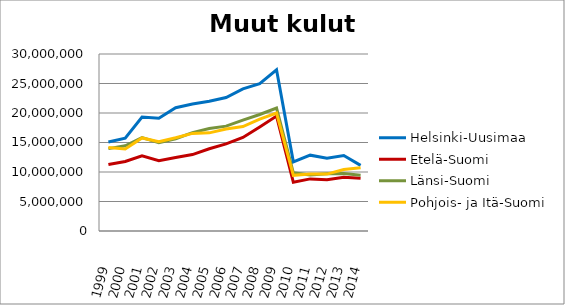
| Category | Helsinki-Uusimaa | Etelä-Suomi | Länsi-Suomi | Pohjois- ja Itä-Suomi |
|---|---|---|---|---|
| 1999.0 | 15075087.82 | 11254549.77 | 13963936.11 | 14151753.8 |
| 2000.0 | 15726916.6 | 11787547.33 | 14441678.84 | 13907825.34 |
| 2001.0 | 19327133.74 | 12736302.24 | 15831894.83 | 15766495.64 |
| 2002.0 | 19112350 | 11929732 | 14955923 | 15120131 |
| 2003.0 | 20891954 | 12464103 | 15641850 | 15793660 |
| 2004.0 | 21535320 | 12956816 | 16668644 | 16540060 |
| 2005.0 | 21977846 | 13947073 | 17362748 | 16637420 |
| 2006.0 | 22621010 | 14776906 | 17777041 | 17283781 |
| 2007.0 | 24081204 | 15861702 | 18786210 | 17693392 |
| 2008.0 | 24973650 | 17632954.11 | 19749101.36 | 18948958.89 |
| 2009.0 | 27330615.55 | 19481878.28 | 20849183.18 | 19991997.11 |
| 2010.0 | 11723418.47 | 8251953.79 | 9857054.69 | 9442593.89 |
| 2011.0 | 12853182.85 | 8830529.61 | 9474036.96 | 9679512.58 |
| 2012.0 | 12332274.93 | 8675414.3 | 9711695.7 | 9647301.83 |
| 2013.0 | 12804209.16 | 9107152.9 | 9733359.87 | 10428916.43 |
| 2014.0 | 11124691.39 | 8956142.5 | 9440315.02 | 10729990.9 |